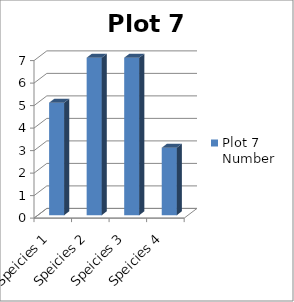
| Category | Plot 7 Number |
|---|---|
| Speicies 1 | 5 |
| Speicies 2 | 7 |
| Speicies 3 | 7 |
| Speicies 4 | 3 |